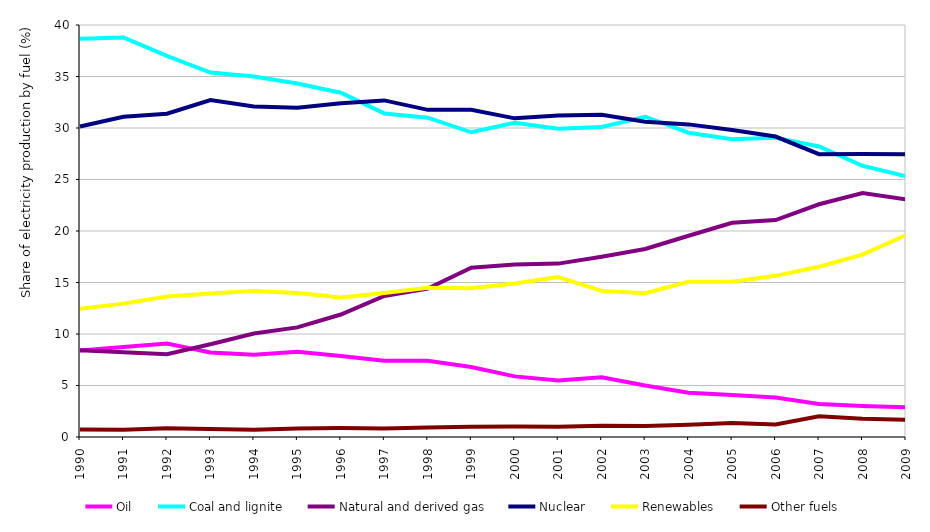
| Category | Oil | Coal and lignite | Natural and derived gas | Nuclear | Renewables | Other fuels |
|---|---|---|---|---|---|---|
| 1990.0 | 8.398 | 38.654 | 8.425 | 30.151 | 12.452 | 0.725 |
| 1991.0 | 8.734 | 38.786 | 8.225 | 31.099 | 12.95 | 0.704 |
| 1992.0 | 9.073 | 37.007 | 8.045 | 31.383 | 13.636 | 0.857 |
| 1993.0 | 8.201 | 35.377 | 9.012 | 32.709 | 13.928 | 0.773 |
| 1994.0 | 7.979 | 34.992 | 10.042 | 32.088 | 14.184 | 0.715 |
| 1995.0 | 8.274 | 34.318 | 10.641 | 31.964 | 13.975 | 0.828 |
| 1996.0 | 7.858 | 33.426 | 11.891 | 32.395 | 13.556 | 0.875 |
| 1997.0 | 7.398 | 31.415 | 13.688 | 32.681 | 13.991 | 0.828 |
| 1998.0 | 7.393 | 31.006 | 14.422 | 31.762 | 14.486 | 0.932 |
| 1999.0 | 6.792 | 29.584 | 16.429 | 31.767 | 14.435 | 0.992 |
| 2000.0 | 5.885 | 30.517 | 16.74 | 30.938 | 14.903 | 1.018 |
| 2001.0 | 5.485 | 29.933 | 16.833 | 31.216 | 15.529 | 1.004 |
| 2002.0 | 5.809 | 30.104 | 17.506 | 31.291 | 14.186 | 1.104 |
| 2003.0 | 4.993 | 31.093 | 18.253 | 30.617 | 13.968 | 1.077 |
| 2004.0 | 4.3 | 29.541 | 19.542 | 30.35 | 15.073 | 1.194 |
| 2005.0 | 4.078 | 28.899 | 20.798 | 29.798 | 15.076 | 1.352 |
| 2006.0 | 3.832 | 29.062 | 21.067 | 29.171 | 15.646 | 1.221 |
| 2007.0 | 3.202 | 28.207 | 22.595 | 27.463 | 16.525 | 2.007 |
| 2008.0 | 3.015 | 26.33 | 23.691 | 27.473 | 17.71 | 1.781 |
| 2009.0 | 2.88 | 25.313 | 23.07 | 27.458 | 19.598 | 1.681 |